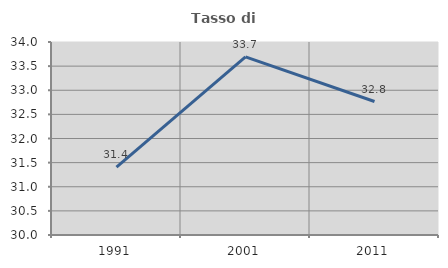
| Category | Tasso di occupazione   |
|---|---|
| 1991.0 | 31.408 |
| 2001.0 | 33.69 |
| 2011.0 | 32.767 |